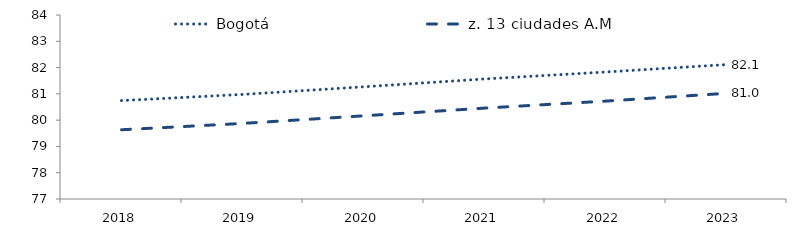
| Category | Bogotá | z. 13 ciudades A.M |
|---|---|---|
| 2018.0 | 80.744 | 79.634 |
| 2019.0 | 80.978 | 79.875 |
| 2020.0 | 81.268 | 80.164 |
| 2021.0 | 81.567 | 80.458 |
| 2022.0 | 81.831 | 80.724 |
| 2023.0 | 82.114 | 81.021 |